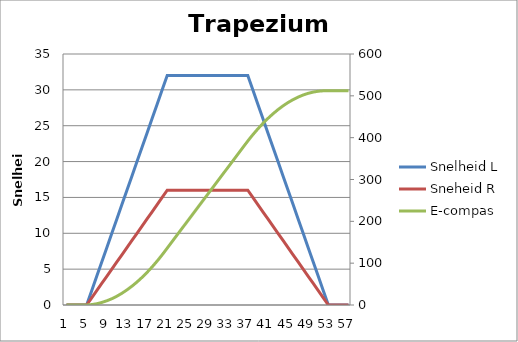
| Category | Snelheid L | Sneheid R |
|---|---|---|
| 0 | 0 | 0 |
| 1 | 0 | 0 |
| 2 | 0 | 0 |
| 3 | 0 | 0 |
| 4 | 0 | 0 |
| 5 | 2 | 1 |
| 6 | 4 | 2 |
| 7 | 6 | 3 |
| 8 | 8 | 4 |
| 9 | 10 | 5 |
| 10 | 12 | 6 |
| 11 | 14 | 7 |
| 12 | 16 | 8 |
| 13 | 18 | 9 |
| 14 | 20 | 10 |
| 15 | 22 | 11 |
| 16 | 24 | 12 |
| 17 | 26 | 13 |
| 18 | 28 | 14 |
| 19 | 30 | 15 |
| 20 | 32 | 16 |
| 21 | 32 | 16 |
| 22 | 32 | 16 |
| 23 | 32 | 16 |
| 24 | 32 | 16 |
| 25 | 32 | 16 |
| 26 | 32 | 16 |
| 27 | 32 | 16 |
| 28 | 32 | 16 |
| 29 | 32 | 16 |
| 30 | 32 | 16 |
| 31 | 32 | 16 |
| 32 | 32 | 16 |
| 33 | 32 | 16 |
| 34 | 32 | 16 |
| 35 | 32 | 16 |
| 36 | 32 | 16 |
| 37 | 30 | 15 |
| 38 | 28 | 14 |
| 39 | 26 | 13 |
| 40 | 24 | 12 |
| 41 | 22 | 11 |
| 42 | 20 | 10 |
| 43 | 18 | 9 |
| 44 | 16 | 8 |
| 45 | 14 | 7 |
| 46 | 12 | 6 |
| 47 | 10 | 5 |
| 48 | 8 | 4 |
| 49 | 6 | 3 |
| 50 | 4 | 2 |
| 51 | 2 | 1 |
| 52 | 0 | 0 |
| 53 | 0 | 0 |
| 54 | 0 | 0 |
| 55 | 0 | 0 |
| 56 | 0 | 0 |